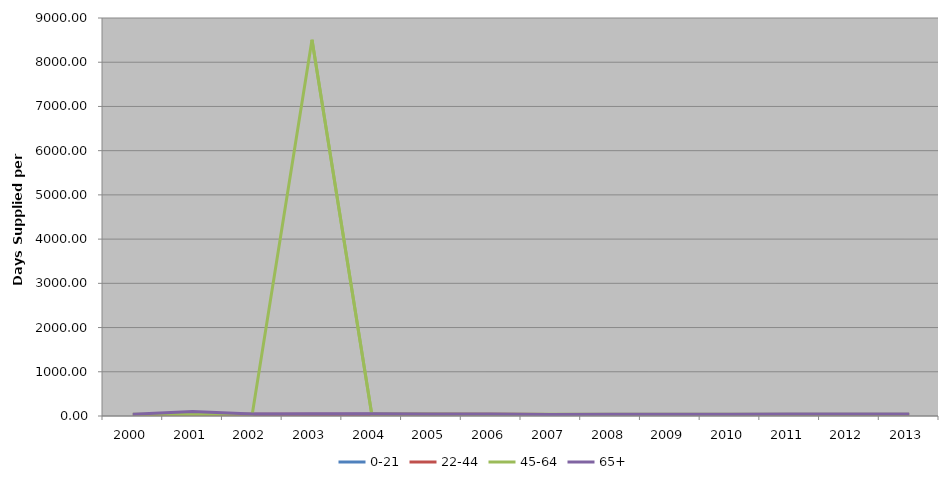
| Category | 0-21 | 22-44 | 45-64 | 65+ |
|---|---|---|---|---|
| 2000 | 30 | 32.789 | 39.564 | 40.937 |
| 2001 | 33.533 | 34.232 | 40.31 | 99.41 |
| 2002 | 39.114 | 37.174 | 44.266 | 48.02 |
| 2003 | 25.694 | 37.812 | 8507.82 | 49.815 |
| 2004 | 38.933 | 37.157 | 44.746 | 49.099 |
| 2005 | 35.579 | 38.921 | 44.086 | 47.972 |
| 2006 | 34.778 | 37.057 | 41.908 | 43.499 |
| 2007 | 32.351 | 34.568 | 38.799 | 36.359 |
| 2008 | 31.697 | 33.253 | 37.389 | 37.141 |
| 2009 | 31.996 | 34.003 | 38.821 | 41.961 |
| 2010 | 33.109 | 34.048 | 38.723 | 41.111 |
| 2011 | 32.72 | 33.947 | 38.926 | 43.364 |
| 2012 | 32.936 | 34.361 | 39.192 | 45.101 |
| 2013 | 32.849 | 34.987 | 40.203 | 47.11 |